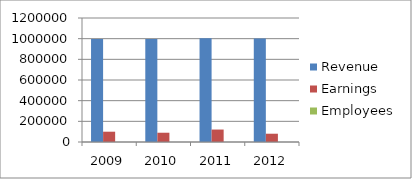
| Category | Revenue | Earnings | Employees |
|---|---|---|---|
| 2009 | 996511 | 99651.1 | 3 |
| 2010 | 997054 | 89734.86 | 4 |
| 2011 | 1004386 | 120526.32 | 4 |
| 2012 | 1001507 | 80120.56 | 6 |